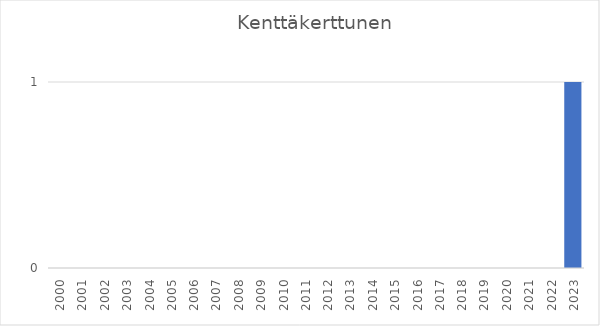
| Category | Series 0 |
|---|---|
| 2000.0 | 0 |
| 2001.0 | 0 |
| 2002.0 | 0 |
| 2003.0 | 0 |
| 2004.0 | 0 |
| 2005.0 | 0 |
| 2006.0 | 0 |
| 2007.0 | 0 |
| 2008.0 | 0 |
| 2009.0 | 0 |
| 2010.0 | 0 |
| 2011.0 | 0 |
| 2012.0 | 0 |
| 2013.0 | 0 |
| 2014.0 | 0 |
| 2015.0 | 0 |
| 2016.0 | 0 |
| 2017.0 | 0 |
| 2018.0 | 0 |
| 2019.0 | 0 |
| 2020.0 | 0 |
| 2021.0 | 0 |
| 2022.0 | 0 |
| 2023.0 | 1 |